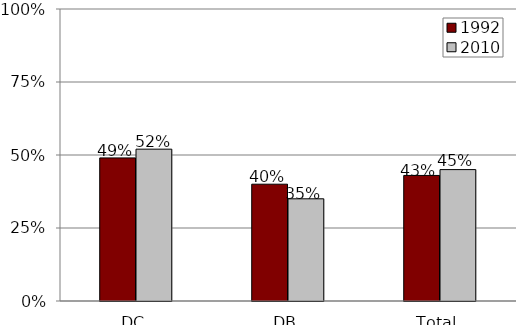
| Category | 1992 | 2010 |
|---|---|---|
| DC | 0.49 | 0.52 |
| DB | 0.4 | 0.35 |
| Total | 0.43 | 0.45 |